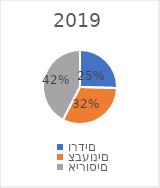
| Category | 2019 |
|---|---|
| ורדים | 0.254 |
| צבעונים | 0.322 |
| אירוסים | 0.424 |